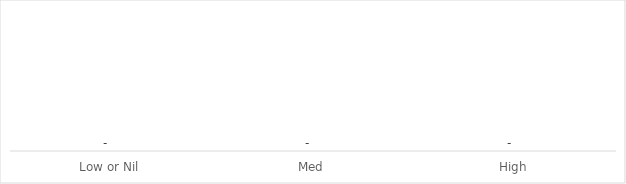
| Category | Series 0 |
|---|---|
| Low or Nil | 0 |
| Med | 0 |
| High | 0 |